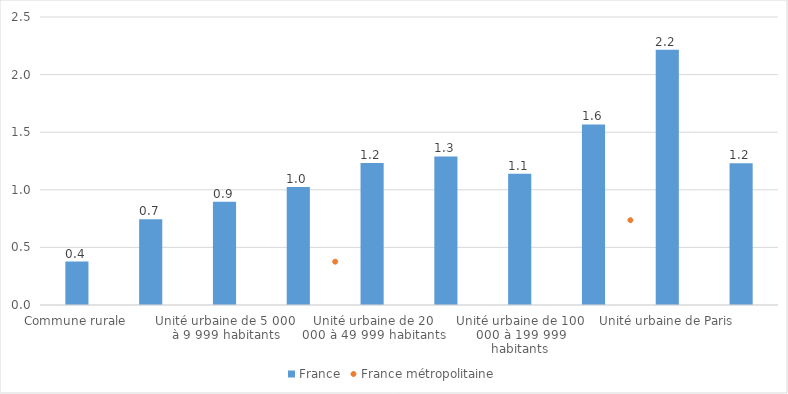
| Category | France |
|---|---|
| Commune rurale | 0.377 |
| Unité urbaine de 2 000 à 4 999 habitants | 0.745 |
| Unité urbaine de 5 000 à 9 999 habitants | 0.897 |
| Unité urbaine de 10 000 à 19 999 habitants | 1.025 |
| Unité urbaine de 20 000 à 49 999 habitants | 1.233 |
| Unité urbaine de 50 000 à 99 999 habitants | 1.289 |
| Unité urbaine de 100 000 à 199 999 habitants | 1.14 |
| Unité urbaine de 200 000 à 1 999 999 habitants | 1.567 |
| Unité urbaine de Paris | 2.217 |
| Total | 1.23 |